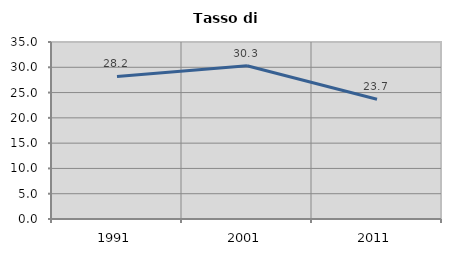
| Category | Tasso di disoccupazione   |
|---|---|
| 1991.0 | 28.2 |
| 2001.0 | 30.316 |
| 2011.0 | 23.69 |